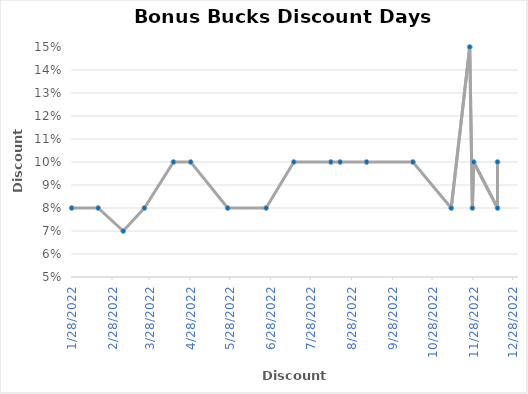
| Category | Discount |
|---|---|
| 12/16/22 | 0.1 |
| 12/16/22 | 0.08 |
| 11/28/22 | 0.1 |
| 11/27/22 | 0.08 |
| 11/25/22 | 0.15 |
| 11/11/22 | 0.08 |
| 10/13/22 | 0.1 |
| 9/8/22 | 0.1 |
| 8/19/22 | 0.1 |
| 8/12/22 | 0.1 |
| 7/15/22 | 0.1 |
| 6/24/22 | 0.08 |
| 5/26/22 | 0.08 |
| 4/28/22 | 0.1 |
| 4/15/22 | 0.1 |
| 3/24/22 | 0.08 |
| 3/8/22 | 0.07 |
| 2/17/22 | 0.08 |
| 1/28/22 | 0.08 |